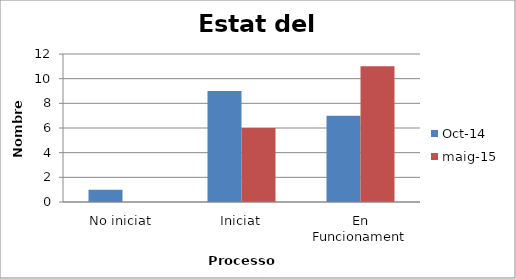
| Category | oct-14 | maig-15 |
|---|---|---|
| No iniciat | 1 | 0 |
| Iniciat | 9 | 6 |
| En Funcionament | 7 | 11 |